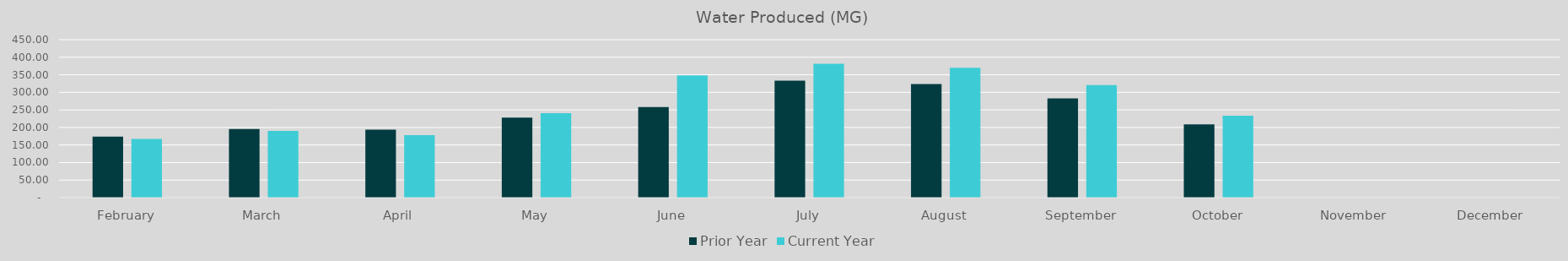
| Category | Prior Year | Current Year |
|---|---|---|
| February | 173.847 | 167.532 |
| March | 195.333 | 190.306 |
| April | 193.551 | 178.22 |
| May | 228.091 | 240.625 |
| June | 257.9 | 348.57 |
| July | 333.37 | 381.34 |
| August | 323.49 | 370.12 |
| September | 282.53 | 320.39 |
| October | 208.72 | 233.34 |
| November | 0 | 0 |
| December | 0 | 0 |